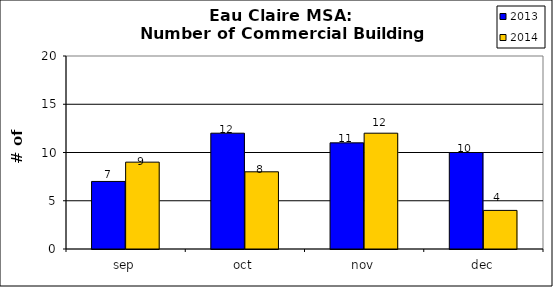
| Category | 2013 | 2014 |
|---|---|---|
| sep | 7 | 9 |
| oct | 12 | 8 |
| nov | 11 | 12 |
| dec | 10 | 4 |